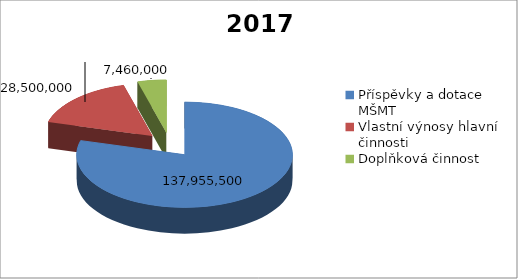
| Category | 2017 |
|---|---|
| Příspěvky a dotace MŠMT | 137955500 |
| Vlastní výnosy hlavní činnosti | 28500000 |
| Doplňková činnost | 7460000 |